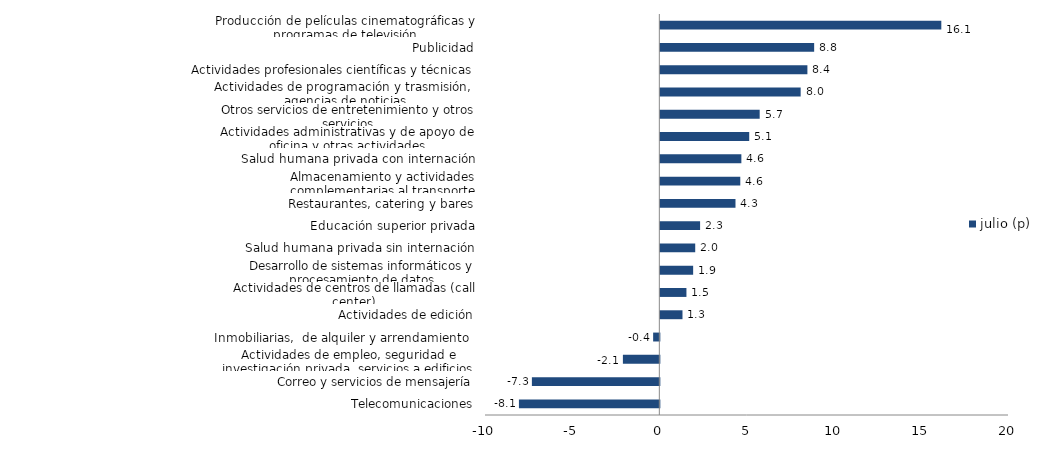
| Category | julio (p) |
|---|---|
| Telecomunicaciones | -8.054 |
| Correo y servicios de mensajería | -7.31 |
| Actividades de empleo, seguridad e investigación privada, servicios a edificios | -2.09 |
| Inmobiliarias,  de alquiler y arrendamiento  | -0.355 |
| Actividades de edición | 1.271 |
| Actividades de centros de llamadas (call center) | 1.498 |
| Desarrollo de sistemas informáticos y procesamiento de datos | 1.882 |
| Salud humana privada sin internación | 2.001 |
| Educación superior privada | 2.281 |
| Restaurantes, catering y bares | 4.311 |
| Almacenamiento y actividades complementarias al transporte | 4.587 |
| Salud humana privada con internación | 4.648 |
| Actividades administrativas y de apoyo de oficina y otras actividades | 5.098 |
| Otros servicios de entretenimiento y otros servicios | 5.699 |
| Actividades de programación y trasmisión,  agencias de noticias | 8.049 |
| Actividades profesionales científicas y técnicas  | 8.436 |
| Publicidad | 8.824 |
| Producción de películas cinematográficas y programas de televisión | 16.118 |